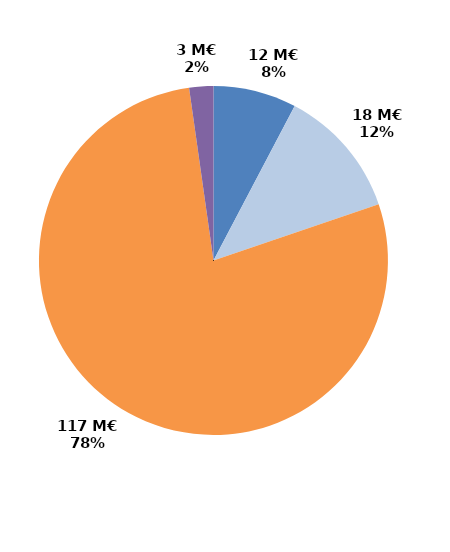
| Category | Series 0 |
|---|---|
| CIF - CPF | 11.595 |
| Période de professionnalisation | 18.166 |
| Plan de formation | 117.389 |
| Autres | 3.367 |